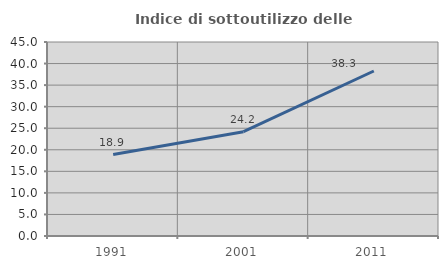
| Category | Indice di sottoutilizzo delle abitazioni  |
|---|---|
| 1991.0 | 18.881 |
| 2001.0 | 24.186 |
| 2011.0 | 38.273 |